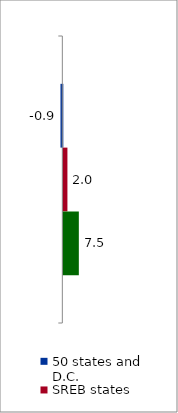
| Category | 50 states and D.C. | SREB states | State |
|---|---|---|---|
| 2014 to 2019 | -0.894 | 1.981 | 7.502 |